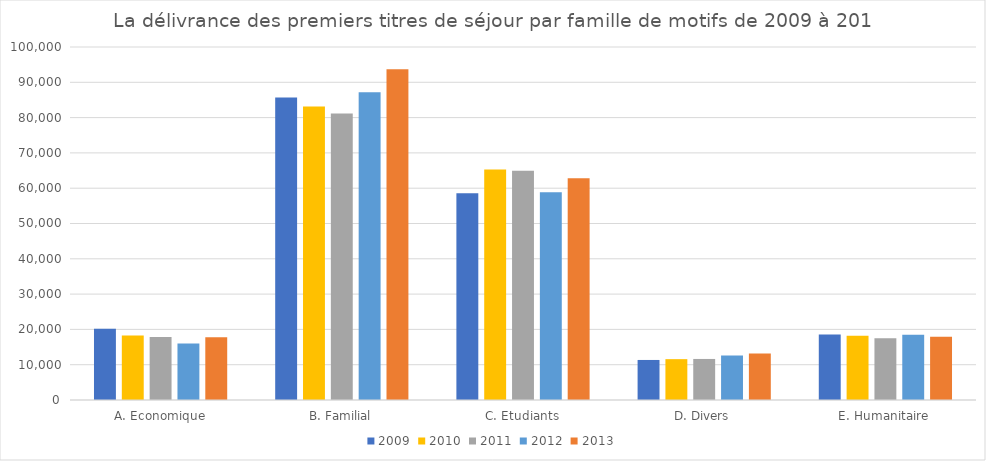
| Category | 2009 | 2010 | 2011 | 2012 | 2013 |
|---|---|---|---|---|---|
| A. Economique | 20181 | 18267 | 17821 | 16013 | 17800 |
| B. Familial | 85715 | 83178 | 81171 | 87170 | 93714 |
| C. Etudiants | 58582 | 65271 | 64925 | 58857 | 62815 |
| D. Divers | 11342 | 11571 | 11627 | 12624 | 13148 |
| E. Humanitaire | 18581 | 18220 | 17487 | 18456 | 17916 |